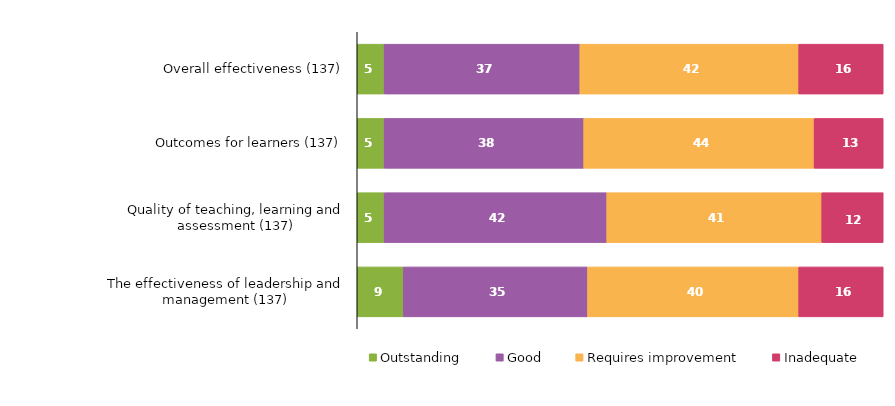
| Category | Outstanding | Good | Requires improvement | Inadequate |
|---|---|---|---|---|
| Overall effectiveness (137) | 5.109 | 37.226 | 41.606 | 16.058 |
| Outcomes for learners (137) | 5.109 | 37.956 | 43.796 | 13.139 |
| Quality of teaching, learning and assessment (137) | 5.109 | 42.336 | 40.876 | 11.679 |
| The effectiveness of leadership and management (137) | 8.759 | 35.036 | 40.146 | 16.058 |